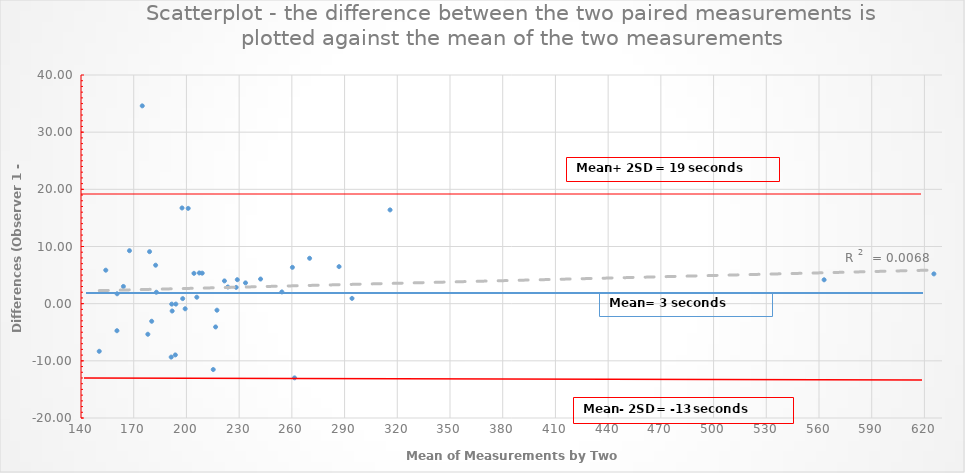
| Category | Scatter |
|---|---|
| 228.95350000000292 | 4.193 |
| 215.25699999999654 | -11.52 |
| 270.0999999999997 | 7.94 |
| 178.04200000000333 | -5.35 |
| 286.85999999999916 | 6.48 |
| 164.12499999999727 | 3.01 |
| 160.55200000000144 | 1.73 |
| 180.22850000000386 | -3.077 |
| 193.69299999999913 | -8.966 |
| 160.45799999999844 | -4.73 |
| 150.37850000000253 | -8.331 |
| 625.3819999999939 | 5.21 |
| 254.30499999999813 | 2.056 |
| 191.63350000000304 | -0.081 |
| 242.18649999999488 | 4.307 |
| 182.89000000000152 | 2 |
| 204.288500000008 | 5.303 |
| 191.34199999999933 | -9.344 |
| 315.8884999999957 | 16.403 |
| 208.97850000000275 | 5.337 |
| 260.3095000000021 | 6.353 |
| 207.3499999999987 | 5.372 |
| 228.31149999999872 | 2.849 |
| 233.62499999999935 | 3.636 |
| 223.53299999999797 | 2.914 |
| 201.00149999999965 | 16.669 |
| 294.2349999999983 | 0.922 |
| 199.27699999999976 | -0.894 |
| 167.58350000000135 | 9.267 |
| 197.8784999999972 | 0.883 |
| 197.5000000000013 | 16.74 |
| 154.10199999999998 | 5.856 |
| 562.9020000000019 | 4.176 |
| 217.37849999999543 | -1.143 |
| 193.97199999999975 | -0.076 |
| 216.59849999999992 | -4.071 |
| 205.90200000000118 | 1.13 |
| 174.85850000000224 | 34.603 |
| 182.47500000000238 | 6.73 |
| 261.53649999999936 | -12.979 |
| 179.0155000000043 | 9.097 |
| 221.63650000000175 | 3.979 |
| 191.88149999999746 | -1.283 |